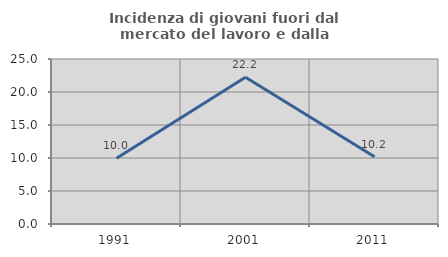
| Category | Incidenza di giovani fuori dal mercato del lavoro e dalla formazione  |
|---|---|
| 1991.0 | 9.964 |
| 2001.0 | 22.222 |
| 2011.0 | 10.204 |